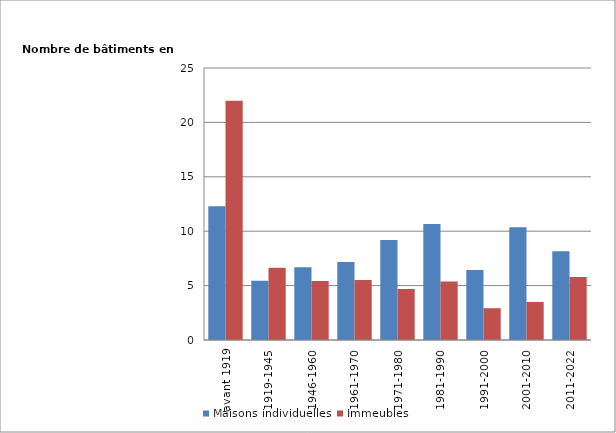
| Category | Maisons individuelles | Immeubles |
|---|---|---|
| avant 1919   | 12300 | 21994 |
| 1919-1945   | 5436 | 6640 |
| 1946-1960   | 6689 | 5432 |
| 1961-1970   | 7171 | 5505 |
| 1971-1980   | 9189 | 4697 |
| 1981-1990   | 10653 | 5370 |
| 1991-2000   | 6445 | 2923 |
| 2001-2010   | 10357 | 3500 |
| 2011-2022   | 8159 | 5797 |